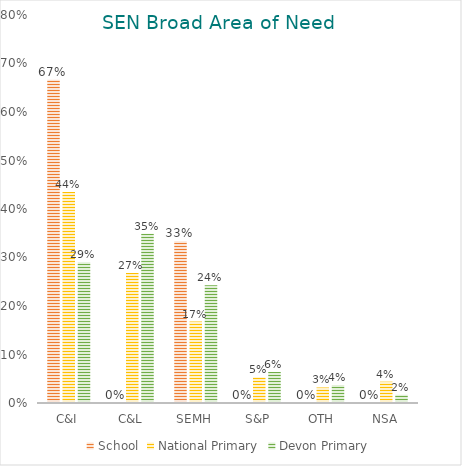
| Category | School | National Primary | Devon Primary |
|---|---|---|---|
| C&I | 0.667 | 0.435 | 0.29 |
| C&L | 0 | 0.268 | 0.349 |
| SEMH | 0.333 | 0.168 | 0.243 |
| S&P | 0 | 0.053 | 0.064 |
| OTH | 0 | 0.032 | 0.037 |
| NSA | 0 | 0.044 | 0.017 |